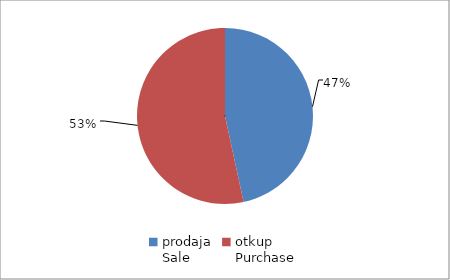
| Category | Series 0 |
|---|---|
| prodaja
Sale | 124373486.96 |
| otkup
Purchase | 142461244.49 |